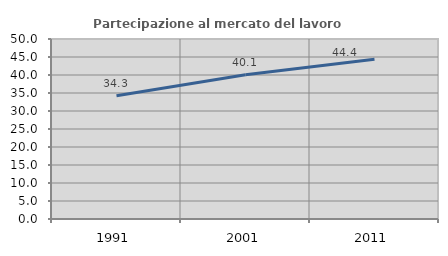
| Category | Partecipazione al mercato del lavoro  femminile |
|---|---|
| 1991.0 | 34.252 |
| 2001.0 | 40.073 |
| 2011.0 | 44.373 |